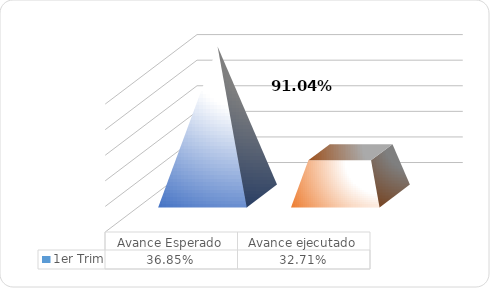
| Category | 1er Trim |
|---|---|
| Avance Esperado | 0.368 |
| Avance ejecutado | 0.327 |